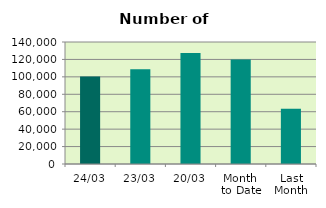
| Category | Series 0 |
|---|---|
| 24/03 | 100448 |
| 23/03 | 108610 |
| 20/03 | 127350 |
| Month 
to Date | 119939.765 |
| Last
Month | 63353.4 |